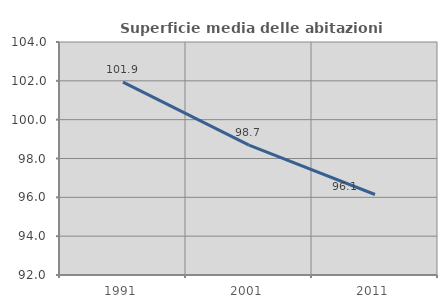
| Category | Superficie media delle abitazioni occupate |
|---|---|
| 1991.0 | 101.935 |
| 2001.0 | 98.692 |
| 2011.0 | 96.147 |